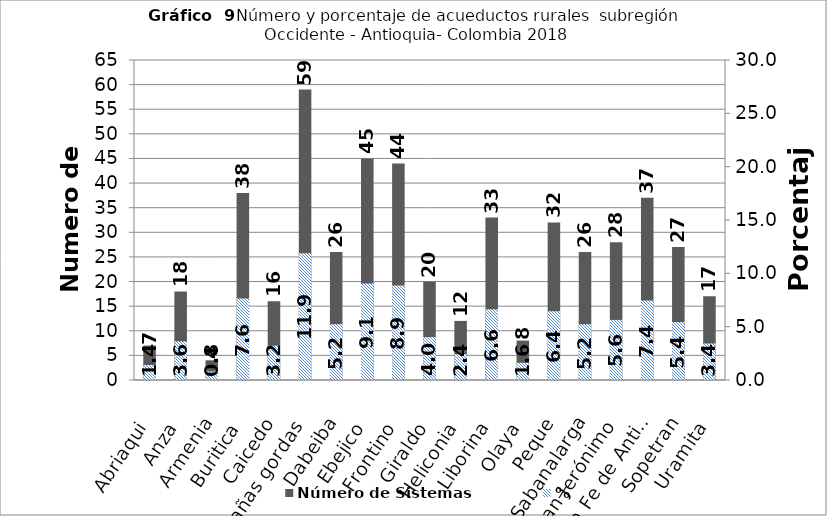
| Category | Número de Sistemas |
|---|---|
| Abriaqui | 7 |
| Anza | 18 |
| Armenia | 4 |
| Buritica | 38 |
| Caicedo | 16 |
| Cañas gordas | 59 |
| Dabeiba | 26 |
| Ebejico | 45 |
| Frontino | 44 |
| Giraldo | 20 |
| Heliconia | 12 |
| Liborina | 33 |
| Olaya | 8 |
| Peque | 32 |
| Sabanalarga | 26 |
| San Jerónimo | 28 |
| Santa Fe de Antioquia | 37 |
| Sopetran | 27 |
| Uramita | 17 |